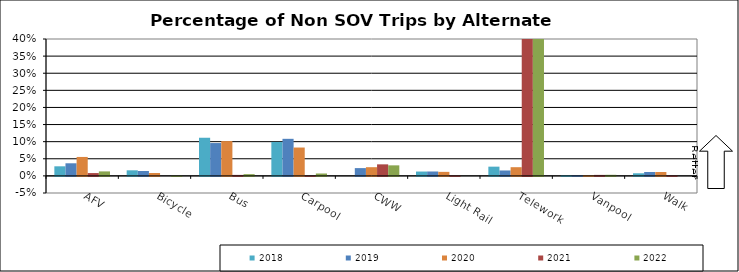
| Category | 2018 | 2019 | 2020 | 2021 | 2022 |
|---|---|---|---|---|---|
| AFV | 0.028 | 0.037 | 0.055 | 0.008 | 0.013 |
| Bicycle | 0.016 | 0.014 | 0.008 | 0 | 0.001 |
| Bus | 0.111 | 0.096 | 0.102 | 0.003 | 0.005 |
| Carpool | 0.099 | 0.108 | 0.083 | 0.001 | 0.007 |
| CWW | 0 | 0.023 | 0.025 | 0.034 | 0.031 |
| Light Rail | 0.013 | 0.013 | 0.012 | 0.002 | 0 |
| Telework | 0.027 | 0.016 | 0.025 | 0.801 | 0.793 |
| Vanpool | 0.003 | 0.002 | 0.002 | 0.003 | 0.003 |
| Walk | 0.008 | 0.011 | 0.011 | 0.002 | 0 |